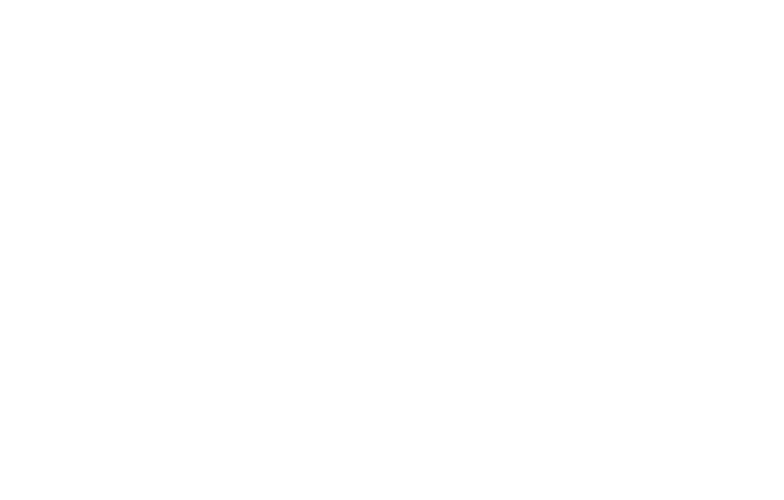
| Category | Sprzedaż  |
|---|---|
| 01 A | 2562.872 |
| 02 B | 3034.867 |
| 03 C | 1888.379 |
| 04 C | 1354.747 |
| 05 B | 1244.261 |
| 06 A | 2468.071 |
| 07 A | 1670.737 |
| 08 A | 1193.494 |
| 09 A | 893.899 |
| 10 A | 1559.523 |
| 11 A | 1772.034 |
| 12 A | 1172.585 |
| 13 A | 947.038 |
| 14 A | 816.792 |
| 15 A | 1380.215 |
| 16 B | 1271.824 |
| 17 B | 1240.846 |
| 18 B | 1433.599 |
| 19 B | 472.63 |
| 20 B | 1425.898 |
| 21 B | 1106.527 |
| 22 B | 1187.716 |
| 23 B | 412.714 |
| 24 B | 1134.171 |
| 25 C | 453.139 |
| 26 C | 1140.772 |
| 27 C | 484.155 |
| 28 C | 1816.731 |
| 29 C | 994.771 |
| 30 C | 784.716 |
| 31 C | 702.294 |
| 32 C | 1259.801 |
| 33 C | 996.986 |
| 34 C | 1899.313 |
| 35 C | 1326.441 |
| 36 C | 1080.626 |
| 37 C | 904.574 |
| 38 C | 1050.662 |
| 39 C | 770.389 |
| 40 C | 1235.959 |
| 41 C | 1222.696 |
| 42 C | 1041.554 |
| 43 C | 1077.667 |
| 44 C | 1641.135 |
| 45 C | 1229.226 |
| 46 C | 633.282 |
| 47 C | 2360.134 |
| 48 C | 2617.544 |
| 49 C | 2283.002 |
| 50 B | 1838.211 |